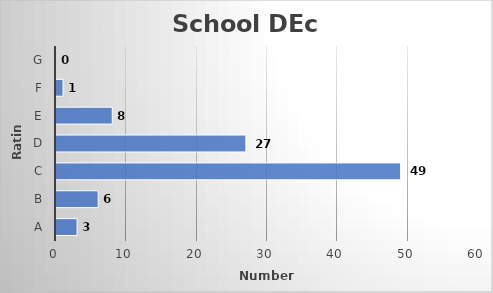
| Category | No of |
|---|---|
| A | 3 |
| B | 6 |
| C | 49 |
| D | 27 |
| E | 8 |
| F | 1 |
| G | 0 |